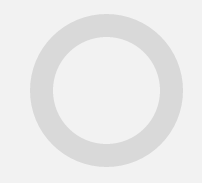
| Category | Series 0 |
|---|---|
| 0 | 0 |
| 1 | 10 |